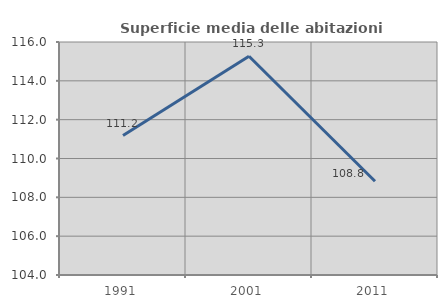
| Category | Superficie media delle abitazioni occupate |
|---|---|
| 1991.0 | 111.184 |
| 2001.0 | 115.269 |
| 2011.0 | 108.829 |